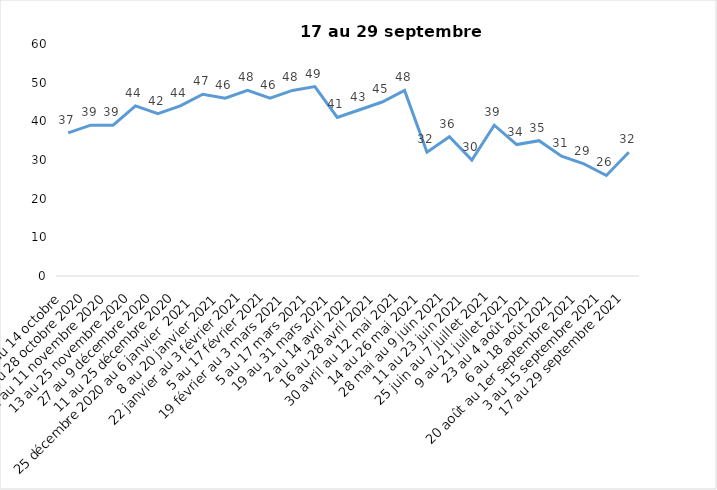
| Category | Toujours aux trois mesures |
|---|---|
| 2 au 14 octobre  | 37 |
| 16 au 28 octobre 2020 | 39 |
| 30 octobre au 11 novembre 2020 | 39 |
| 13 au 25 novembre 2020 | 44 |
| 27 au 9 décembre 2020 | 42 |
| 11 au 25 décembre 2020 | 44 |
| 25 décembre 2020 au 6 janvier  2021 | 47 |
| 8 au 20 janvier 2021 | 46 |
| 22 janvier au 3 février 2021 | 48 |
| 5 au 17 février 2021 | 46 |
| 19 février au 3 mars 2021 | 48 |
| 5 au 17 mars 2021 | 49 |
| 19 au 31 mars 2021 | 41 |
| 2 au 14 avril 2021 | 43 |
| 16 au 28 avril 2021 | 45 |
| 30 avril au 12 mai 2021 | 48 |
| 14 au 26 mai 2021 | 32 |
| 28 mai au 9 juin 2021 | 36 |
| 11 au 23 juin 2021 | 30 |
| 25 juin au 7 juillet 2021 | 39 |
| 9 au 21 juillet 2021 | 34 |
| 23 au 4 août 2021 | 35 |
| 6 au 18 août 2021 | 31 |
| 20 août au 1er septembre 2021 | 29 |
| 3 au 15 septembre 2021 | 26 |
| 17 au 29 septembre 2021 | 32 |